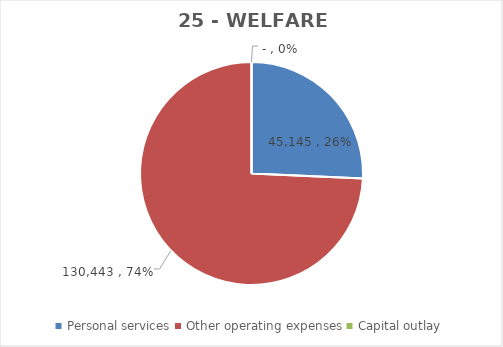
| Category | Series 0 | Series 1 | Series 2 | Series 3 | Series 4 | Series 5 | Series 6 | Series 7 |
|---|---|---|---|---|---|---|---|---|
| Personal services | 45145 |  |  |  | 47383 | 46034 | 45145 | 45145 |
| Other operating expenses | 130443 |  |  |  | 97762 | 123306 | 130443 | 130443 |
| Capital outlay | 0 |  |  |  | 0 | 0 | 0 | 0 |